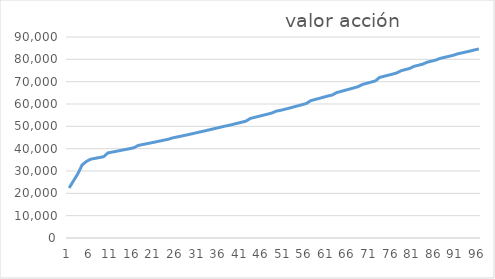
| Category | Series 0 |
|---|---|
| 0 | 22405.067 |
| 1 | 25606.107 |
| 2 | 28685.847 |
| 3 | 32695.875 |
| 4 | 34275.172 |
| 5 | 35288.527 |
| 6 | 35659.914 |
| 7 | 36035.209 |
| 8 | 36414.453 |
| 9 | 38112.842 |
| 10 | 38481.73 |
| 11 | 38854.189 |
| 12 | 39230.254 |
| 13 | 39611.59 |
| 14 | 39996.657 |
| 15 | 40385.493 |
| 16 | 41449.799 |
| 17 | 41835.203 |
| 18 | 42224.219 |
| 19 | 42611.477 |
| 20 | 43007.691 |
| 21 | 43407.617 |
| 22 | 43811.293 |
| 23 | 44218.753 |
| 24 | 44826.696 |
| 25 | 45225.659 |
| 26 | 45628.614 |
| 27 | 46035.577 |
| 28 | 46463.293 |
| 29 | 46895.008 |
| 30 | 47330.76 |
| 31 | 47770.587 |
| 32 | 48214.528 |
| 33 | 48662.622 |
| 34 | 49114.91 |
| 35 | 49571.43 |
| 36 | 50032.223 |
| 37 | 50422.639 |
| 38 | 50892.746 |
| 39 | 51367.3 |
| 40 | 51846.342 |
| 41 | 52329.92 |
| 42 | 53525.879 |
| 43 | 54002.453 |
| 44 | 54483.343 |
| 45 | 54968.591 |
| 46 | 55458.237 |
| 47 | 55952.326 |
| 48 | 56790.641 |
| 49 | 57153.355 |
| 50 | 57638.45 |
| 51 | 58128.222 |
| 52 | 58644.228 |
| 53 | 59164.857 |
| 54 | 59690.151 |
| 55 | 60220.154 |
| 56 | 61476.42 |
| 57 | 61996.29 |
| 58 | 62520.604 |
| 59 | 63049.403 |
| 60 | 63582.725 |
| 61 | 64013.129 |
| 62 | 65087.657 |
| 63 | 65611.961 |
| 64 | 66140.576 |
| 65 | 66673.54 |
| 66 | 67210.891 |
| 67 | 67752.67 |
| 68 | 68744.688 |
| 69 | 69269.797 |
| 70 | 69799.023 |
| 71 | 70332.401 |
| 72 | 71911.805 |
| 73 | 72399.138 |
| 74 | 72890.83 |
| 75 | 73386.837 |
| 76 | 73917.009 |
| 77 | 74921.435 |
| 78 | 75431.049 |
| 79 | 75944.269 |
| 80 | 76875.484 |
| 81 | 77366.066 |
| 82 | 77859.93 |
| 83 | 78707.766 |
| 84 | 79176.957 |
| 85 | 79653.657 |
| 86 | 80418.254 |
| 87 | 80868.562 |
| 88 | 81321.82 |
| 89 | 81778.078 |
| 90 | 82423.611 |
| 91 | 82851.392 |
| 92 | 83281.927 |
| 93 | 83715.277 |
| 94 | 84219.871 |
| 95 | 84622.771 |